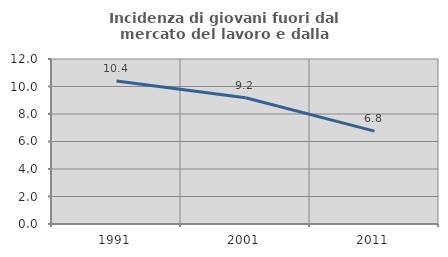
| Category | Incidenza di giovani fuori dal mercato del lavoro e dalla formazione  |
|---|---|
| 1991.0 | 10.405 |
| 2001.0 | 9.176 |
| 2011.0 | 6.755 |